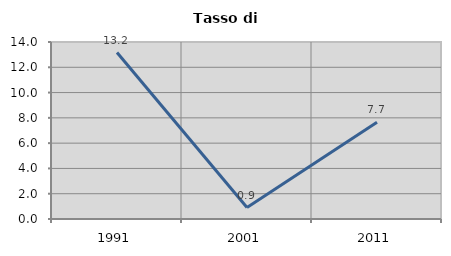
| Category | Tasso di disoccupazione   |
|---|---|
| 1991.0 | 13.167 |
| 2001.0 | 0.905 |
| 2011.0 | 7.661 |